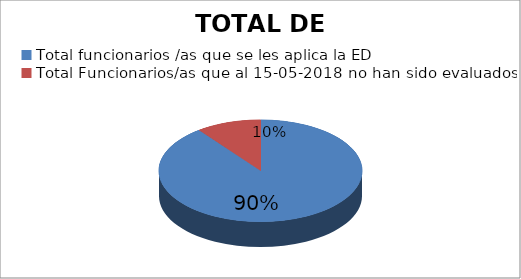
| Category | Series 0 |
|---|---|
| Total funcionarios /as que se les aplica la ED  | 156 |
| Total Funcionarios/as que al 15-05-2018 no han sido evaluados | 18 |